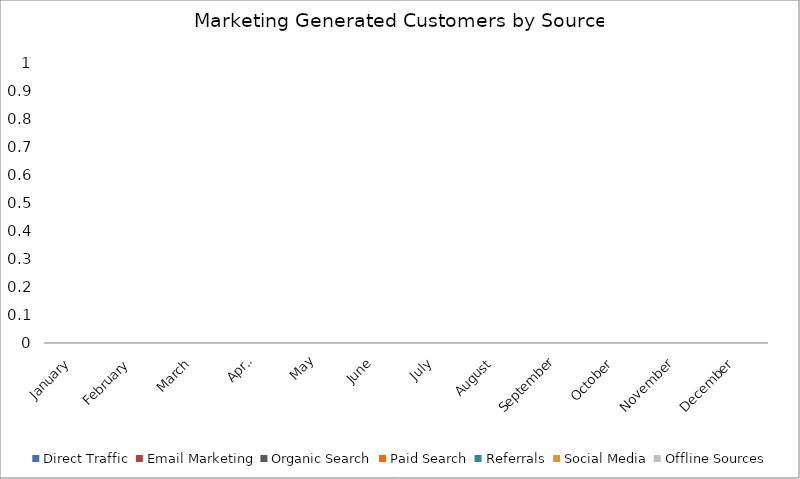
| Category | Direct Traffic | Email Marketing | Organic Search | Paid Search | Referrals | Social Media | Offline Sources |
|---|---|---|---|---|---|---|---|
| January | 0 | 0 | 0 | 0 | 0 | 0 | 0 |
| February | 0 | 0 | 0 | 0 | 0 | 0 | 0 |
| March | 0 | 0 | 0 | 0 | 0 | 0 | 0 |
| April | 0 | 0 | 0 | 0 | 0 | 0 | 0 |
| May | 0 | 0 | 0 | 0 | 0 | 0 | 0 |
| June | 0 | 0 | 0 | 0 | 0 | 0 | 0 |
| July | 0 | 0 | 0 | 0 | 0 | 0 | 0 |
| August | 0 | 0 | 0 | 0 | 0 | 0 | 0 |
| September | 0 | 0 | 0 | 0 | 0 | 0 | 0 |
| October | 0 | 0 | 0 | 0 | 0 | 0 | 0 |
| November | 0 | 0 | 0 | 0 | 0 | 0 | 0 |
| December | 0 | 0 | 0 | 0 | 0 | 0 | 0 |